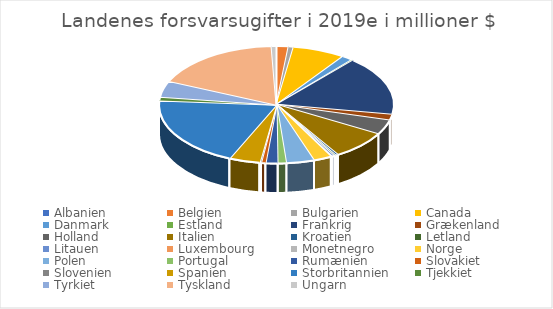
| Category | Landenes forsvarsugifter i 2019e i millioner $ |
|---|---|
| Albanien | 198 |
| Belgien | 4921 |
| Bulgarien | 2179 |
| Canada | 22485 |
| Danmark | 4651 |
| Estland | 670 |
| Frankrig | 50729 |
| Grækenland | 4940 |
| Holland | 12478 |
| Italien | 24482 |
| Kroatien | 1032 |
| Letland | 724 |
| Litauen  | 1107 |
| Luxembourg  | 395 |
| Monetnegro | 92 |
| Norge | 7708 |
| Polen  | 11902 |
| Portugal | 3613 |
| Rumænien  | 5050 |
| Slovakiet | 1905 |
| Slovenien  | 581 |
| Spanien  | 13156 |
| Storbritannien | 60761 |
| Tjekkiet | 2967 |
| Tyrkiet | 13919 |
| Tyskland | 54751 |
| Ungarn | 2080 |